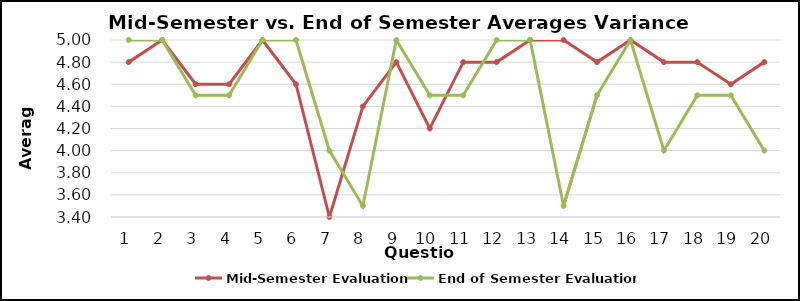
| Category | Mid-Semester Evaluation | End of Semester Evaluation |
|---|---|---|
| 0 | 4.8 | 5 |
| 1 | 5 | 5 |
| 2 | 4.6 | 4.5 |
| 3 | 4.6 | 4.5 |
| 4 | 5 | 5 |
| 5 | 4.6 | 5 |
| 6 | 3.4 | 4 |
| 7 | 4.4 | 3.5 |
| 8 | 4.8 | 5 |
| 9 | 4.2 | 4.5 |
| 10 | 4.8 | 4.5 |
| 11 | 4.8 | 5 |
| 12 | 5 | 5 |
| 13 | 5 | 3.5 |
| 14 | 4.8 | 4.5 |
| 15 | 5 | 5 |
| 16 | 4.8 | 4 |
| 17 | 4.8 | 4.5 |
| 18 | 4.6 | 4.5 |
| 19 | 4.8 | 4 |